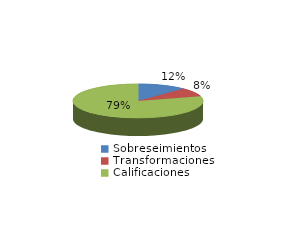
| Category | Series 0 |
|---|---|
| Sobreseimientos | 1042 |
| Transformaciones | 725 |
| Calificaciones | 6820 |